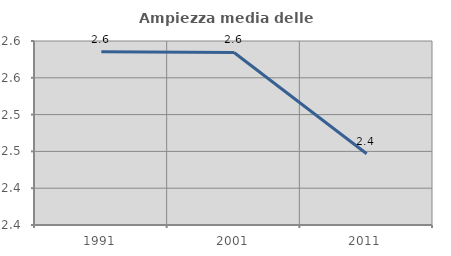
| Category | Ampiezza media delle famiglie |
|---|---|
| 1991.0 | 2.585 |
| 2001.0 | 2.584 |
| 2011.0 | 2.447 |